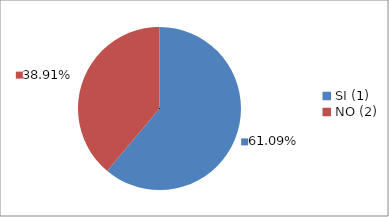
| Category | Series 0 |
|---|---|
| SI (1) | 0.611 |
| NO (2) | 0.389 |